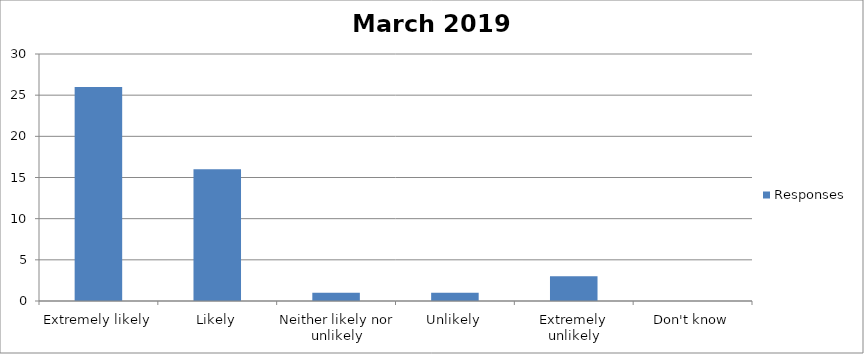
| Category | Responses |
|---|---|
| Extremely likely | 26 |
| Likely | 16 |
| Neither likely nor unlikely | 1 |
| Unlikely | 1 |
| Extremely unlikely | 3 |
| Don't know | 0 |